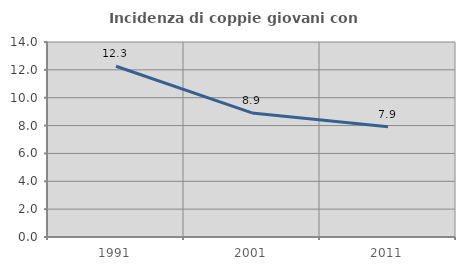
| Category | Incidenza di coppie giovani con figli |
|---|---|
| 1991.0 | 12.261 |
| 2001.0 | 8.911 |
| 2011.0 | 7.914 |